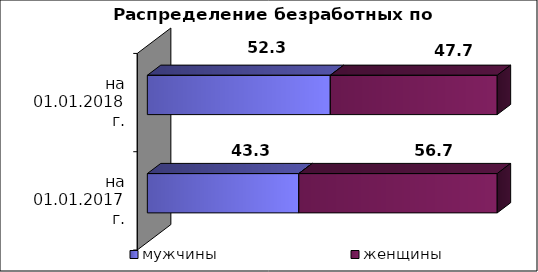
| Category | мужчины  | женщины  |
|---|---|---|
| на 01.01.2017 г. | 43.3 | 56.7 |
| на 01.01.2018 г. | 52.3 | 47.7 |